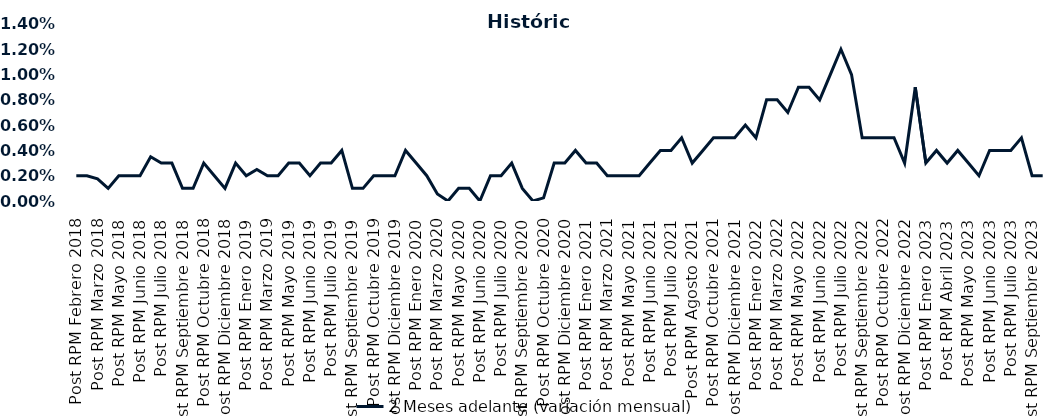
| Category | 2 Meses adelante (variación mensual) |
|---|---|
| Post RPM Febrero 2018 | 0.002 |
| Pre RPM Marzo 2018 | 0.002 |
| Post RPM Marzo 2018 | 0.002 |
| Pre RPM Mayo 2018 | 0.001 |
| Post RPM Mayo 2018 | 0.002 |
| Pre RPM Junio 2018 | 0.002 |
| Post RPM Junio 2018 | 0.002 |
| Pre RPM Julio 2018 | 0.004 |
| Post RPM Julio 2018 | 0.003 |
| Pre RPM Septiembre 2018 | 0.003 |
| Post RPM Septiembre 2018 | 0.001 |
| Pre RPM Octubre 2018 | 0.001 |
| Post RPM Octubre 2018 | 0.003 |
| Pre RPM Diciembre 2018 | 0.002 |
| Post RPM Diciembre 2018 | 0.001 |
| Pre RPM Enero 2019 | 0.003 |
| Post RPM Enero 2019 | 0.002 |
| Pre RPM Marzo 2019 | 0.002 |
| Post RPM Marzo 2019 | 0.002 |
| Pre RPM Mayo 2019 | 0.002 |
| Post RPM Mayo 2019 | 0.003 |
| Pre RPM Junio 2019 | 0.003 |
| Post RPM Junio 2019 | 0.002 |
| Pre RPM Julio 2019 | 0.003 |
| Post RPM Julio 2019 | 0.003 |
| Pre RPM Septiembre 2019 | 0.004 |
| Post RPM Septiembre 2019 | 0.001 |
| Pre RPM Octubre 2019 | 0.001 |
| Post RPM Octubre 2019 | 0.002 |
| Pre RPM Diciembre 2019 | 0.002 |
| Post RPM Diciembre 2019 | 0.002 |
| Pre RPM Enero 2020 | 0.004 |
| Post RPM Enero 2020 | 0.003 |
| Pre RPM Marzo 2020 | 0.002 |
| Post RPM Marzo 2020 | 0.001 |
| Pre RPM Mayo 2020 | 0 |
| Post RPM Mayo 2020 | 0.001 |
| Pre RPM Junio 2020 | 0.001 |
| Post RPM Junio 2020 | 0 |
| Pre RPM Julio 2020 | 0.002 |
| Post RPM Julio 2020 | 0.002 |
| Pre RPM Septiembre 2020 | 0.003 |
| Post RPM Septiembre 2020 | 0.001 |
| Pre RPM Octubre 2020 | 0 |
| Post RPM Octubre 2020 | 0 |
| Pre RPM Diciembre 2020 | 0.003 |
| Post RPM Diciembre 2020 | 0.003 |
| Pre RPM Enero 2021 | 0.004 |
| Post RPM Enero 2021 | 0.003 |
| Pre RPM Marzo 2021 | 0.003 |
| Post RPM Marzo 2021 | 0.002 |
| Pre RPM Mayo 2021 | 0.002 |
| Post RPM Mayo 2021 | 0.002 |
| Pre RPM Junio 2021 | 0.002 |
| Post RPM Junio 2021 | 0.003 |
| Pre RPM Julio 2021 | 0.004 |
| Post RPM Julio 2021 | 0.004 |
| Pre RPM Agosto 2021 | 0.005 |
| Post RPM Agosto 2021 | 0.003 |
| Pre RPM Octubre 2021 | 0.004 |
| Post RPM Octubre 2021 | 0.005 |
| Pre RPM Diciembre 2021 | 0.005 |
| Post RPM Diciembre 2021 | 0.005 |
| Pre RPM Enero 2022 | 0.006 |
| Post RPM Enero 2022 | 0.005 |
| Pre RPM Marzo 2022 | 0.008 |
| Post RPM Marzo 2022 | 0.008 |
| Pre RPM Mayo 2022 | 0.007 |
| Post RPM Mayo 2022 | 0.009 |
| Pre RPM Junio 2022 | 0.009 |
| Post RPM Junio 2022 | 0.008 |
| Pre RPM Julio 2022 | 0.01 |
| Post RPM Julio 2022 | 0.012 |
| Pre RPM Septiembre 2022 | 0.01 |
| Post RPM Septiembre 2022 | 0.005 |
| Pre RPM Octubre 2022 | 0.005 |
| Post RPM Octubre 2022 | 0.005 |
| Pre RPM Diciembre 2022 | 0.005 |
| Post RPM Diciembre 2022 | 0.003 |
| Pre RPM Enero 2023 | 0.009 |
| Post RPM Enero 2023 | 0.003 |
| Pre RPM Abril 2023 | 0.004 |
| Post RPM Abril 2023 | 0.003 |
| Pre RPM Mayo 2023 | 0.004 |
| Post RPM Mayo 2023 | 0.003 |
| Pre RPM Junio 2023 | 0.002 |
| Post RPM Junio 2023 | 0.004 |
| Pre RPM Julio 2023 | 0.004 |
| Post RPM Julio 2023 | 0.004 |
| Pre RPM Septiembre 2023 | 0.005 |
| Post RPM Septiembre 2023 | 0.002 |
| Pre RPM Octubre 2023 | 0.002 |